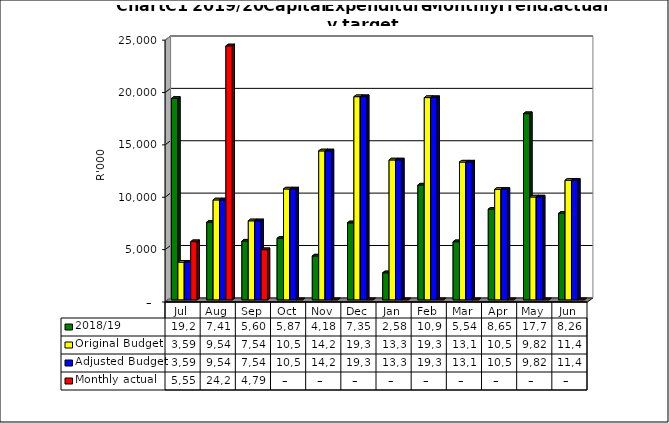
| Category | 2018/19 | Original Budget | Adjusted Budget | Monthly actual |
|---|---|---|---|---|
| Jul | 19231011.37 | 3597000 | 3597000 | 5554740.23 |
| Aug | 7413792.52 | 9540000 | 9540000 | 24246351.16 |
| Sep | 5606695.82 | 7545000 | 7545000 | 4790238.71 |
| Oct | 5872546.52 | 10583000 | 10583000 | 0 |
| Nov | 4185356.82 | 14220000 | 14220000 | 0 |
| Dec | 7353836.19 | 19396000 | 19396000 | 0 |
| Jan | 2583015.59 | 13356000 | 13356000 | 0 |
| Feb | 10959701.7 | 19309000 | 19309000 | 0 |
| Mar | 5548374.54 | 13155000 | 13155000 | 0 |
| Apr | 8654474.54 | 10547000 | 10547000 | 0 |
| May | 17774802.17 | 9821000 | 9821000 | 0 |
| Jun | 8264280 | 11417000 | 11417000 | 0 |